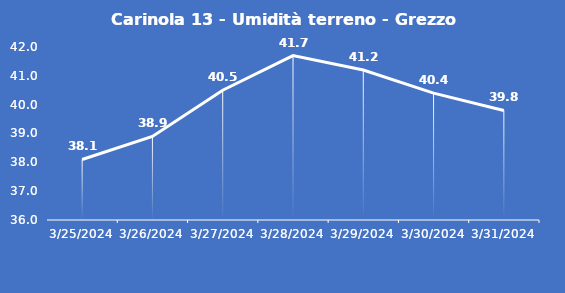
| Category | Carinola 13 - Umidità terreno - Grezzo (%VWC) |
|---|---|
| 3/25/24 | 38.1 |
| 3/26/24 | 38.9 |
| 3/27/24 | 40.5 |
| 3/28/24 | 41.7 |
| 3/29/24 | 41.2 |
| 3/30/24 | 40.4 |
| 3/31/24 | 39.8 |